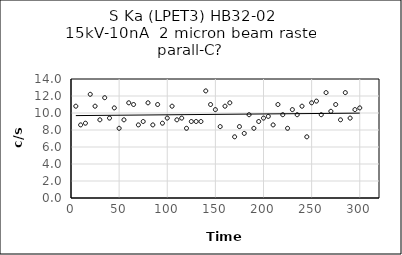
| Category | Series 0 |
|---|---|
| 5.0 | 10.8 |
| 10.0 | 8.6 |
| 15.0 | 8.8 |
| 20.0 | 12.2 |
| 25.0 | 10.8 |
| 30.0 | 9.2 |
| 35.0 | 11.8 |
| 40.0 | 9.4 |
| 45.0 | 10.6 |
| 50.0 | 8.2 |
| 55.0 | 9.2 |
| 60.0 | 11.2 |
| 65.0 | 11 |
| 70.0 | 8.6 |
| 75.0 | 9 |
| 80.0 | 11.2 |
| 85.0 | 8.6 |
| 90.0 | 11 |
| 95.0 | 8.8 |
| 100.0 | 9.4 |
| 105.0 | 10.8 |
| 110.0 | 9.2 |
| 115.0 | 9.4 |
| 120.0 | 8.2 |
| 125.0 | 9 |
| 130.0 | 9 |
| 135.0 | 9 |
| 140.0 | 12.6 |
| 145.0 | 11 |
| 150.0 | 10.4 |
| 155.0 | 8.4 |
| 160.0 | 10.8 |
| 165.0 | 11.2 |
| 170.0 | 7.2 |
| 175.0 | 8.4 |
| 180.0 | 7.6 |
| 185.0 | 9.8 |
| 190.0 | 8.2 |
| 195.0 | 9 |
| 200.0 | 9.4 |
| 205.0 | 9.6 |
| 210.0 | 8.6 |
| 215.0 | 11 |
| 220.0 | 9.8 |
| 225.0 | 8.2 |
| 230.0 | 10.4 |
| 235.0 | 9.8 |
| 240.0 | 10.8 |
| 245.0 | 7.2 |
| 250.0 | 11.2 |
| 255.0 | 11.4 |
| 260.0 | 9.8 |
| 265.0 | 12.4 |
| 270.0 | 10.2 |
| 275.0 | 11 |
| 280.0 | 9.2 |
| 285.0 | 12.4 |
| 290.0 | 9.4 |
| 295.0 | 10.4 |
| 300.0 | 10.6 |